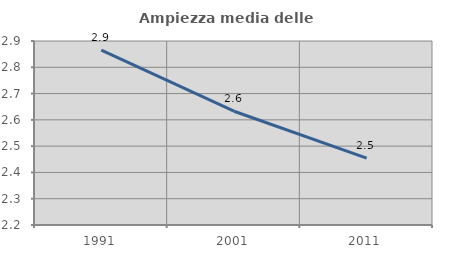
| Category | Ampiezza media delle famiglie |
|---|---|
| 1991.0 | 2.865 |
| 2001.0 | 2.633 |
| 2011.0 | 2.454 |